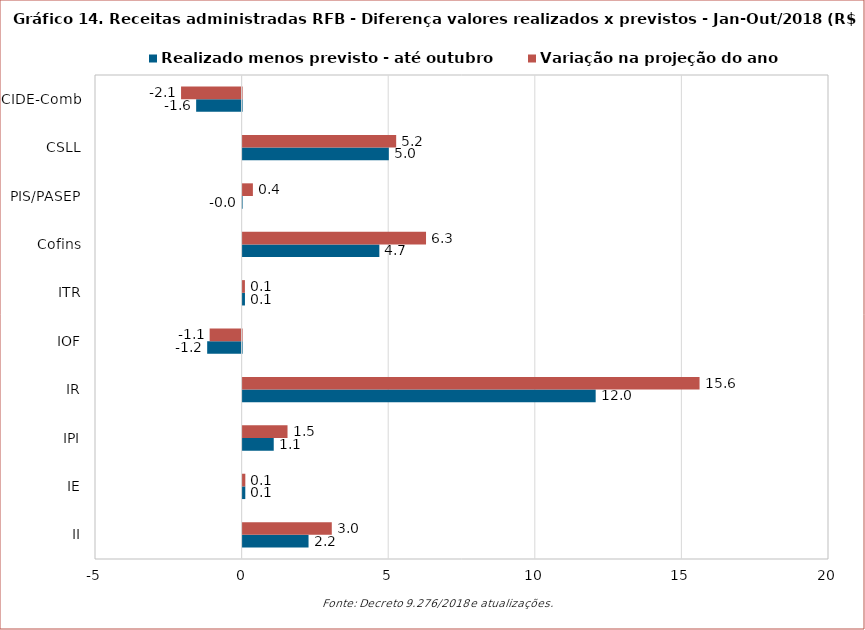
| Category | Realizado menos previsto - até outubro | Variação na projeção do ano |
|---|---|---|
| II | 2.249 | 3.042 |
| IE | 0.092 | 0.093 |
| IPI | 1.062 | 1.532 |
| IR | 12.042 | 15.585 |
| IOF | -1.174 | -1.09 |
| ITR | 0.08 | 0.079 |
| Cofins | 4.664 | 6.256 |
| PIS/PASEP | -0.018 | 0.351 |
| CSLL | 4.987 | 5.238 |
| CIDE-Comb | -1.55 | -2.065 |